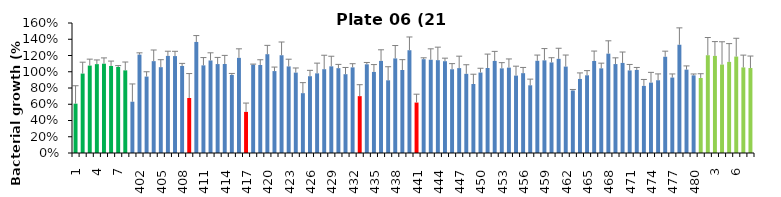
| Category | 21 h % |
|---|---|
| 1.0 | 0.607 |
| 2.0 | 0.977 |
| 3.0 | 1.076 |
| 4.0 | 1.094 |
| 5.0 | 1.099 |
| 6.0 | 1.071 |
| 7.0 | 1.058 |
| 8.0 | 1.017 |
| 401.0 | 0.631 |
| 402.0 | 1.211 |
| 403.0 | 0.941 |
| 404.0 | 1.131 |
| 405.0 | 1.056 |
| 406.0 | 1.195 |
| 407.0 | 1.193 |
| 408.0 | 1.071 |
| 409.0 | 0.677 |
| 410.0 | 1.367 |
| 411.0 | 1.079 |
| 412.0 | 1.139 |
| 413.0 | 1.094 |
| 414.0 | 1.095 |
| 415.0 | 0.961 |
| 416.0 | 1.171 |
| 417.0 | 0.506 |
| 418.0 | 1.087 |
| 419.0 | 1.083 |
| 420.0 | 1.216 |
| 421.0 | 1.008 |
| 422.0 | 1.203 |
| 423.0 | 1.066 |
| 424.0 | 0.989 |
| 425.0 | 0.736 |
| 426.0 | 0.945 |
| 427.0 | 0.98 |
| 428.0 | 1.031 |
| 429.0 | 1.067 |
| 430.0 | 1.044 |
| 431.0 | 0.97 |
| 432.0 | 1.054 |
| 433.0 | 0.7 |
| 434.0 | 1.091 |
| 435.0 | 0.998 |
| 436.0 | 1.134 |
| 437.0 | 0.895 |
| 438.0 | 1.164 |
| 439.0 | 1.022 |
| 440.0 | 1.265 |
| 441.0 | 0.621 |
| 442.0 | 1.155 |
| 443.0 | 1.148 |
| 444.0 | 1.143 |
| 445.0 | 1.13 |
| 446.0 | 1.031 |
| 447.0 | 1.045 |
| 448.0 | 0.974 |
| 449.0 | 0.849 |
| 450.0 | 0.99 |
| 451.0 | 1.046 |
| 452.0 | 1.134 |
| 453.0 | 1.042 |
| 454.0 | 1.051 |
| 455.0 | 0.953 |
| 456.0 | 0.983 |
| 457.0 | 0.833 |
| 458.0 | 1.135 |
| 459.0 | 1.14 |
| 460.0 | 1.115 |
| 461.0 | 1.159 |
| 462.0 | 1.064 |
| 463.0 | 0.769 |
| 464.0 | 0.911 |
| 465.0 | 0.956 |
| 466.0 | 1.133 |
| 467.0 | 1.042 |
| 468.0 | 1.223 |
| 469.0 | 1.094 |
| 470.0 | 1.109 |
| 471.0 | 1.016 |
| 472.0 | 1.022 |
| 473.0 | 0.826 |
| 474.0 | 0.866 |
| 475.0 | 0.896 |
| 476.0 | 1.185 |
| 477.0 | 0.929 |
| 478.0 | 1.332 |
| 479.0 | 1.026 |
| 480.0 | 0.956 |
| 1.0 | 0.923 |
| 2.0 | 1.203 |
| 3.0 | 1.195 |
| 4.0 | 1.088 |
| 5.0 | 1.122 |
| 6.0 | 1.187 |
| 7.0 | 1.053 |
| 8.0 | 1.046 |